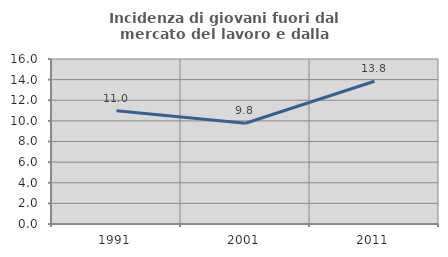
| Category | Incidenza di giovani fuori dal mercato del lavoro e dalla formazione  |
|---|---|
| 1991.0 | 10.97 |
| 2001.0 | 9.77 |
| 2011.0 | 13.846 |